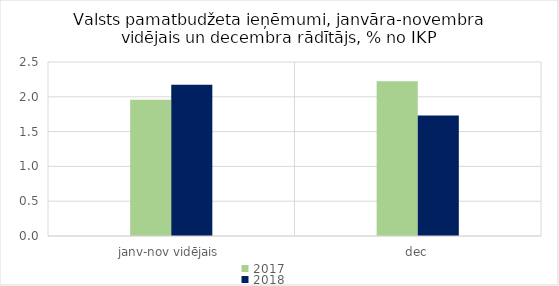
| Category | 2017 | 2018 |
|---|---|---|
| janv-nov vidējais | 1.958 | 2.175 |
| dec | 2.225 | 1.73 |